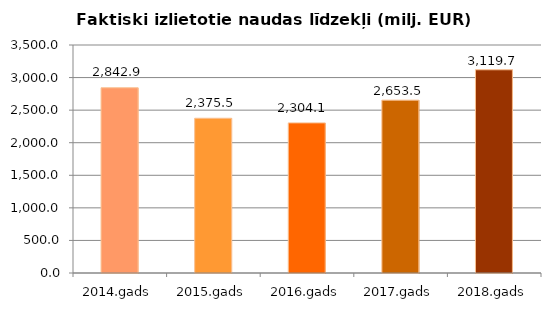
| Category | Faktiski izlietotie naudas līdzekļi (milj. EUR) ar PVN |
|---|---|
| 2014.gads | 2842.887 |
| 2015.gads | 2375.471 |
| 2016.gads | 2304.104 |
| 2017.gads | 2653.503 |
| 2018.gads | 3119.679 |